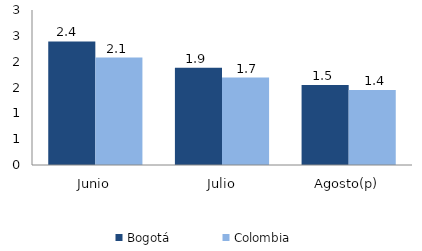
| Category | Bogotá | Colombia |
|---|---|---|
| Junio | 2.393 | 2.081 |
| Julio | 1.88 | 1.692 |
| Agosto(p) | 1.547 | 1.45 |